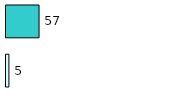
| Category | Series 0 | Series 1 |
|---|---|---|
| 0 | 5 | 57 |